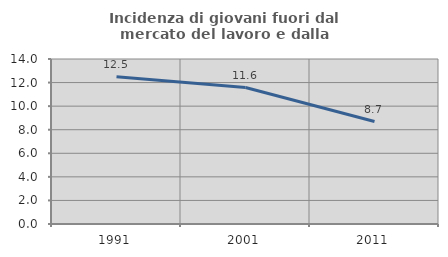
| Category | Incidenza di giovani fuori dal mercato del lavoro e dalla formazione  |
|---|---|
| 1991.0 | 12.5 |
| 2001.0 | 11.579 |
| 2011.0 | 8.696 |